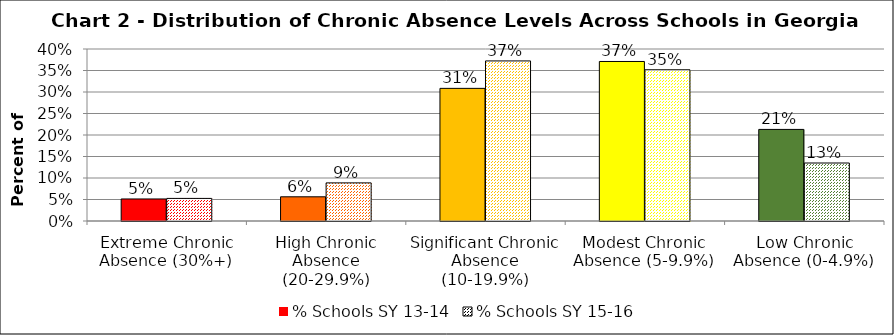
| Category | % Schools SY 13-14 | % Schools SY 15-16 |
|---|---|---|
| Extreme Chronic Absence (30%+) | 0.051 | 0.053 |
| High Chronic Absence (20-29.9%) | 0.056 | 0.089 |
| Significant Chronic Absence (10-19.9%) | 0.308 | 0.372 |
| Modest Chronic Absence (5-9.9%) | 0.371 | 0.352 |
| Low Chronic Absence (0-4.9%) | 0.213 | 0.135 |